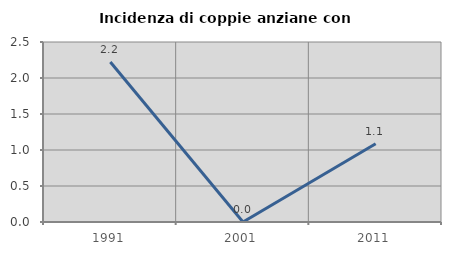
| Category | Incidenza di coppie anziane con figli |
|---|---|
| 1991.0 | 2.222 |
| 2001.0 | 0 |
| 2011.0 | 1.087 |